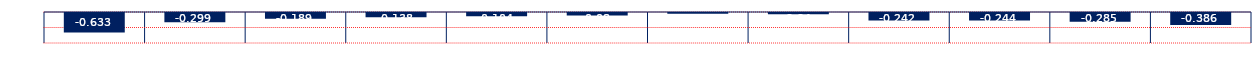
| Category | Spread |
|---|---|
| Mar 24, Aug 24 | -0.633 |
| Apr 24, Sep 24 | -0.299 |
| May 24, Oct 24 | -0.189 |
| Jun 24, Nov 24 | -0.138 |
| Jul 24, Dec 24 | -0.104 |
| Aug 24, Jan 25 | -0.08 |
| Sep 24, Feb 25 | -0.026 |
| Oct 24, Mar 25 | -0.04 |
| Nov 24, Apr 25 | -0.242 |
| Dec 24, May 25 | -0.244 |
| Jan 25, Jun 25 | -0.285 |
| Feb 25, Jul 25 | -0.386 |